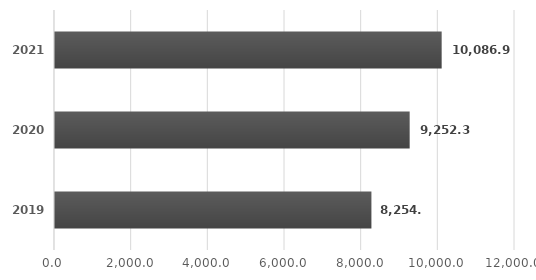
| Category | Series 0 |
|---|---|
| 2019.0 | 8254.3 |
| 2020.0 | 9252.3 |
| 2021.0 | 10086.9 |